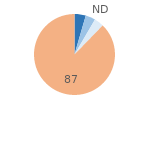
| Category | Series 0 |
|---|---|
| Importants | 4.446 |
| Assez importants | 3.914 |
| Peu importants | 3.755 |
| Pas de dégradations | 86.694 |